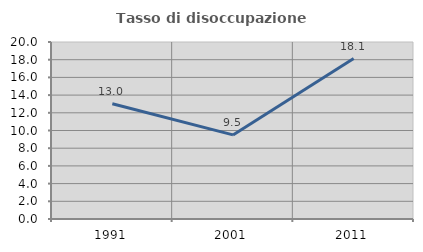
| Category | Tasso di disoccupazione giovanile  |
|---|---|
| 1991.0 | 13.018 |
| 2001.0 | 9.502 |
| 2011.0 | 18.125 |